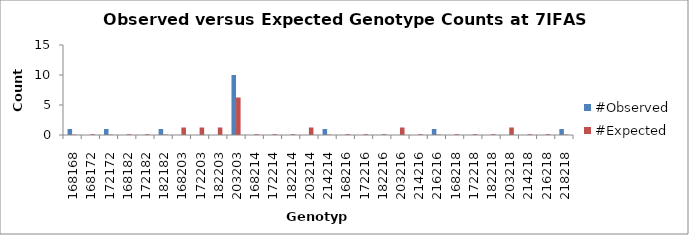
| Category | #Observed | #Expected |
|---|---|---|
| 168168.0 | 1 | 0.062 |
| 168172.0 | 0 | 0.125 |
| 172172.0 | 1 | 0.062 |
| 168182.0 | 0 | 0.125 |
| 172182.0 | 0 | 0.125 |
| 182182.0 | 1 | 0.062 |
| 168203.0 | 0 | 1.25 |
| 172203.0 | 0 | 1.25 |
| 182203.0 | 0 | 1.25 |
| 203203.0 | 10 | 6.25 |
| 168214.0 | 0 | 0.125 |
| 172214.0 | 0 | 0.125 |
| 182214.0 | 0 | 0.125 |
| 203214.0 | 0 | 1.25 |
| 214214.0 | 1 | 0.062 |
| 168216.0 | 0 | 0.125 |
| 172216.0 | 0 | 0.125 |
| 182216.0 | 0 | 0.125 |
| 203216.0 | 0 | 1.25 |
| 214216.0 | 0 | 0.125 |
| 216216.0 | 1 | 0.062 |
| 168218.0 | 0 | 0.125 |
| 172218.0 | 0 | 0.125 |
| 182218.0 | 0 | 0.125 |
| 203218.0 | 0 | 1.25 |
| 214218.0 | 0 | 0.125 |
| 216218.0 | 0 | 0.125 |
| 218218.0 | 1 | 0.062 |